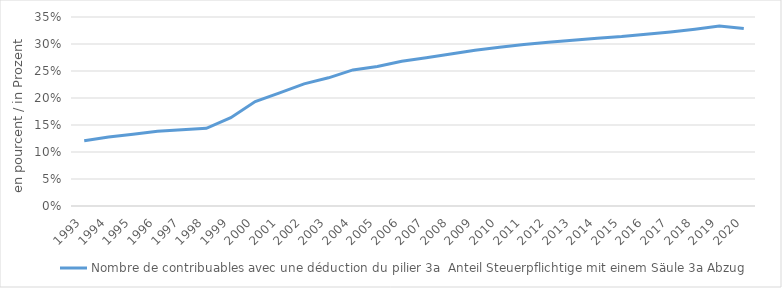
| Category | Nombre de contribuables avec une déduction du pilier 3a  |
|---|---|
| 1993 | 0.121 |
| 1994 | 0.128 |
| 1995 | 0.133 |
| 1996 | 0.139 |
| 1997 | 0.141 |
| 1998 | 0.144 |
| 1999 | 0.164 |
| 2000 | 0.193 |
| 2001 | 0.209 |
| 2002 | 0.226 |
| 2003 | 0.237 |
| 2004 | 0.252 |
| 2005 | 0.258 |
| 2006 | 0.268 |
| 2007 | 0.274 |
| 2008 | 0.281 |
| 2009 | 0.289 |
| 2010 | 0.294 |
| 2011 | 0.299 |
| 2012 | 0.303 |
| 2013 | 0.307 |
| 2014 | 0.311 |
| 2015 | 0.314 |
| 2016 | 0.318 |
| 2017 | 0.322 |
| 2018 | 0.327 |
| 2019 | 0.333 |
| 2020 | 0.329 |